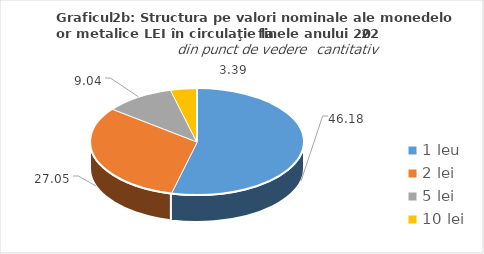
| Category | Series 0 |
|---|---|
| 1 leu | 46.18 |
| 2 lei | 27.045 |
| 5 lei | 9.036 |
| 10 lei | 3.39 |